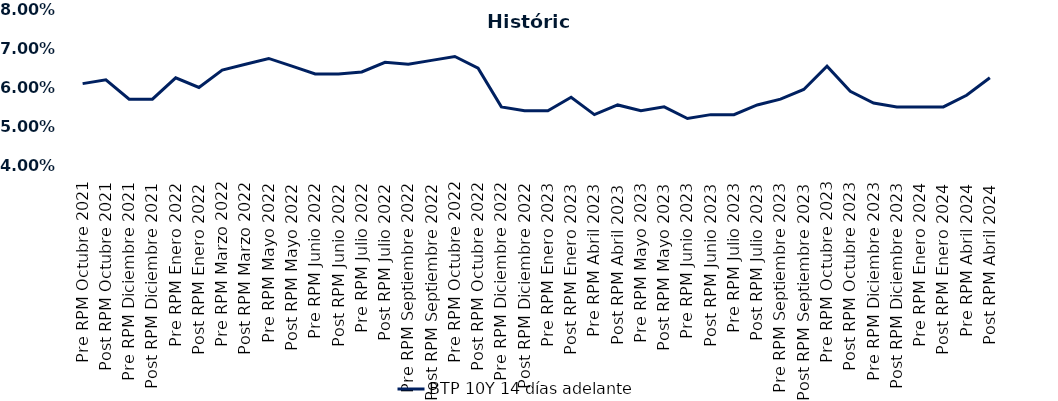
| Category | BTP 10Y 14 días adelante |
|---|---|
| Pre RPM Octubre 2021 | 0.061 |
| Post RPM Octubre 2021 | 0.062 |
| Pre RPM Diciembre 2021 | 0.057 |
| Post RPM Diciembre 2021 | 0.057 |
| Pre RPM Enero 2022 | 0.062 |
| Post RPM Enero 2022 | 0.06 |
| Pre RPM Marzo 2022 | 0.064 |
| Post RPM Marzo 2022 | 0.066 |
| Pre RPM Mayo 2022 | 0.068 |
| Post RPM Mayo 2022 | 0.066 |
| Pre RPM Junio 2022 | 0.064 |
| Post RPM Junio 2022 | 0.064 |
| Pre RPM Julio 2022 | 0.064 |
| Post RPM Julio 2022 | 0.066 |
| Pre RPM Septiembre 2022 | 0.066 |
| Post RPM Septiembre 2022 | 0.067 |
| Pre RPM Octubre 2022 | 0.068 |
| Post RPM Octubre 2022 | 0.065 |
| Pre RPM Diciembre 2022 | 0.055 |
| Post RPM Diciembre 2022 | 0.054 |
| Pre RPM Enero 2023 | 0.054 |
| Post RPM Enero 2023 | 0.058 |
| Pre RPM Abril 2023 | 0.053 |
| Post RPM Abril 2023 | 0.056 |
| Pre RPM Mayo 2023 | 0.054 |
| Post RPM Mayo 2023 | 0.055 |
| Pre RPM Junio 2023 | 0.052 |
| Post RPM Junio 2023 | 0.053 |
| Pre RPM Julio 2023 | 0.053 |
| Post RPM Julio 2023 | 0.056 |
| Pre RPM Septiembre 2023 | 0.057 |
| Post RPM Septiembre 2023 | 0.06 |
| Pre RPM Octubre 2023 | 0.066 |
| Post RPM Octubre 2023 | 0.059 |
| Pre RPM Diciembre 2023 | 0.056 |
| Post RPM Diciembre 2023 | 0.055 |
| Pre RPM Enero 2024 | 0.055 |
| Post RPM Enero 2024 | 0.055 |
| Pre RPM Abril 2024 | 0.058 |
| Post RPM Abril 2024 | 0.062 |